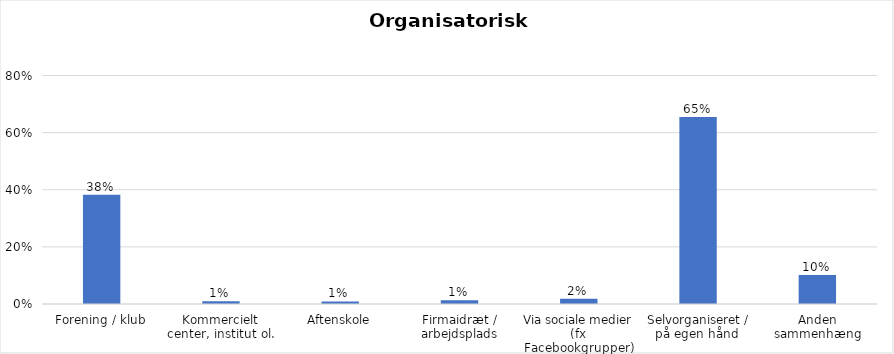
| Category | % |
|---|---|
| Forening / klub | 0.383 |
| Kommercielt center, institut ol. | 0.01 |
| Aftenskole | 0.009 |
| Firmaidræt / arbejdsplads | 0.013 |
| Via sociale medier (fx Facebookgrupper) | 0.018 |
| Selvorganiseret / på egen hånd  | 0.655 |
| Anden sammenhæng | 0.102 |